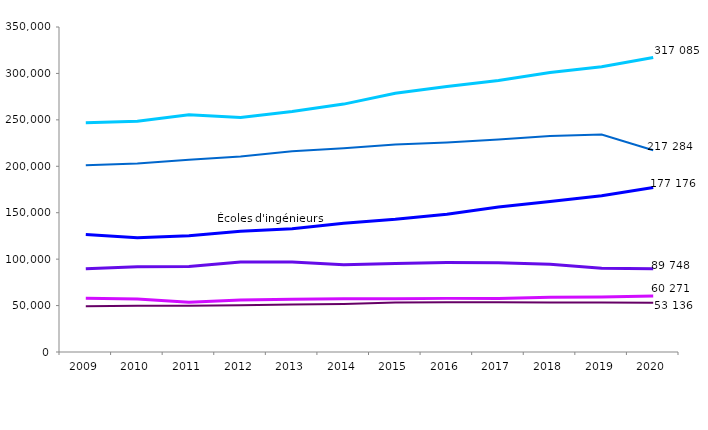
| Category | Université (formations scientifiques + ingénieurs) | Université (santé) | Écoles d'ingénieurs | STS et assimilés scientifique | DUT scientifique | CPGE scientifique |
|---|---|---|---|---|---|---|
| 2009.0 | 246848 | 201073 | 126570 | 89605 | 57858 | 49326 |
| 2010.0 | 248381 | 202912 | 123018 | 91793 | 56982 | 49678 |
| 2011.0 | 255594 | 206947 | 125268 | 92039 | 53572 | 49747 |
| 2012.0 | 252633 | 210424 | 129924 | 96878 | 56033 | 50479 |
| 2013.0 | 258993 | 216224 | 132745 | 96824 | 56710 | 51202 |
| 2014.0 | 266962 | 219328 | 138757 | 94060 | 57302 | 51774 |
| 2015.0 | 278635 | 223528 | 142903 | 95427 | 57310 | 53204 |
| 2016.0 | 285817 | 225662 | 148460 | 96410 | 57750 | 53681 |
| 2017.0 | 292434 | 228800 | 156123 | 96171 | 57678 | 53599 |
| 2018.0 | 301050 | 232512 | 162187 | 94598 | 59005 | 53305 |
| 2019.0 | 307170 | 234109 | 168226 | 90209 | 59220 | 53218 |
| 2020.0 | 317085 | 217284 | 177176 | 89748 | 60271 | 53136 |